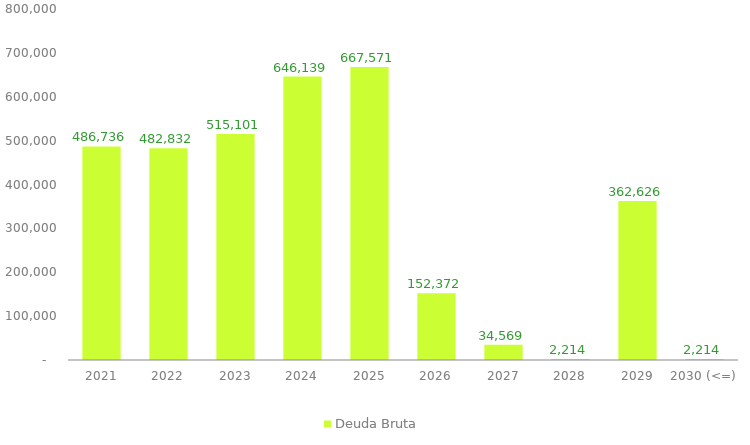
| Category | Deuda Bruta |
|---|---|
| 2021 | 486735.931 |
| 2022 | 482832.109 |
| 2023 | 515101.415 |
| 2024 | 646139.18 |
| 2025 | 667570.668 |
| 2026 | 152372.373 |
| 2027 | 34568.662 |
| 2028 | 2213.704 |
| 2029 | 362626.204 |
| 2030 (<=) | 2213.704 |